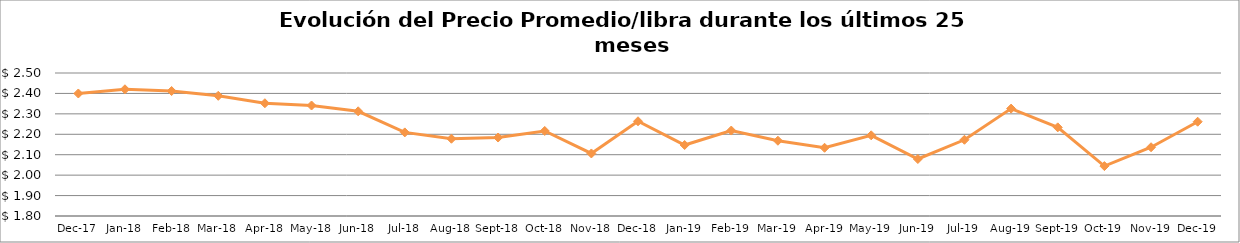
| Category | Series 0 |
|---|---|
| 2017-12-01 | 2.4 |
| 2018-01-01 | 2.42 |
| 2018-02-01 | 2.412 |
| 2018-03-01 | 2.388 |
| 2018-04-01 | 2.352 |
| 2018-05-01 | 2.341 |
| 2018-06-01 | 2.312 |
| 2018-07-01 | 2.209 |
| 2018-08-01 | 2.178 |
| 2018-09-01 | 2.184 |
| 2018-10-01 | 2.216 |
| 2018-11-01 | 2.106 |
| 2018-12-01 | 2.264 |
| 2019-01-01 | 2.147 |
| 2019-02-01 | 2.218 |
| 2019-03-01 | 2.169 |
| 2019-04-01 | 2.134 |
| 2019-05-01 | 2.195 |
| 2019-06-01 | 2.079 |
| 2019-07-01 | 2.173 |
| 2019-08-01 | 2.326 |
| 2019-09-01 | 2.234 |
| 2019-10-01 | 2.044 |
| 2019-11-01 | 2.137 |
| 2019-12-01 | 2.262 |